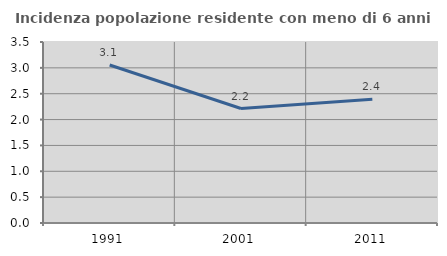
| Category | Incidenza popolazione residente con meno di 6 anni |
|---|---|
| 1991.0 | 3.056 |
| 2001.0 | 2.214 |
| 2011.0 | 2.392 |